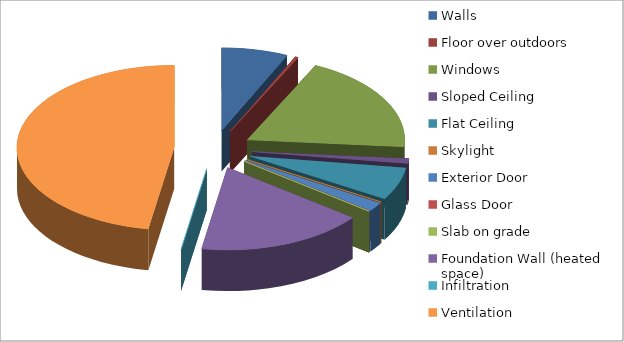
| Category | Series 0 |
|---|---|
| Walls | 1795.889 |
| Floor over outdoors | 82.895 |
| Windows | 5056.97 |
| Sloped Ceiling | 246.842 |
| Flat Ceiling | 1681.75 |
| Skylight | 0 |
| Exterior Door | 457.516 |
| Glass Door | 0 |
| Slab on grade | 0 |
| Foundation Wall (heated space) | 4534.75 |
| Infiltration | 0 |
| Ventilation | 12474 |